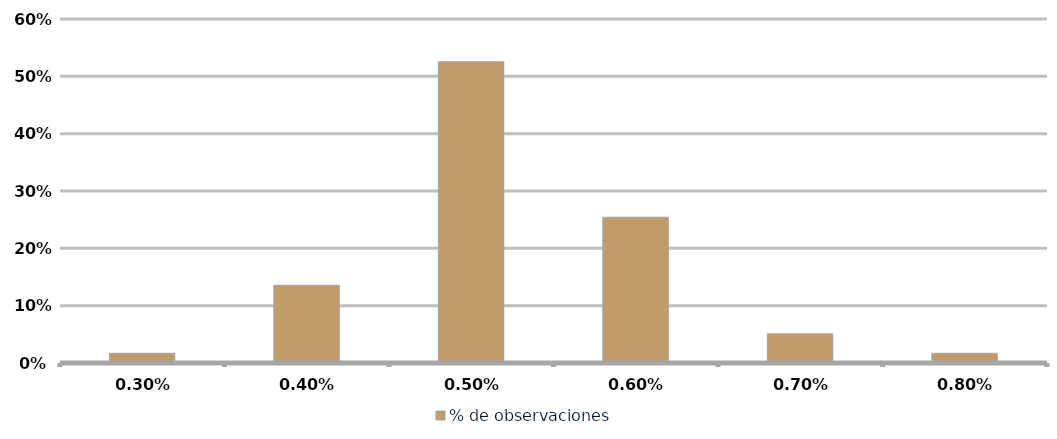
| Category | % de observaciones  |
|---|---|
| 0.003 | 0.017 |
| 0.004 | 0.136 |
| 0.005 | 0.525 |
| 0.006 | 0.254 |
| 0.007 | 0.051 |
| 0.008 | 0.017 |